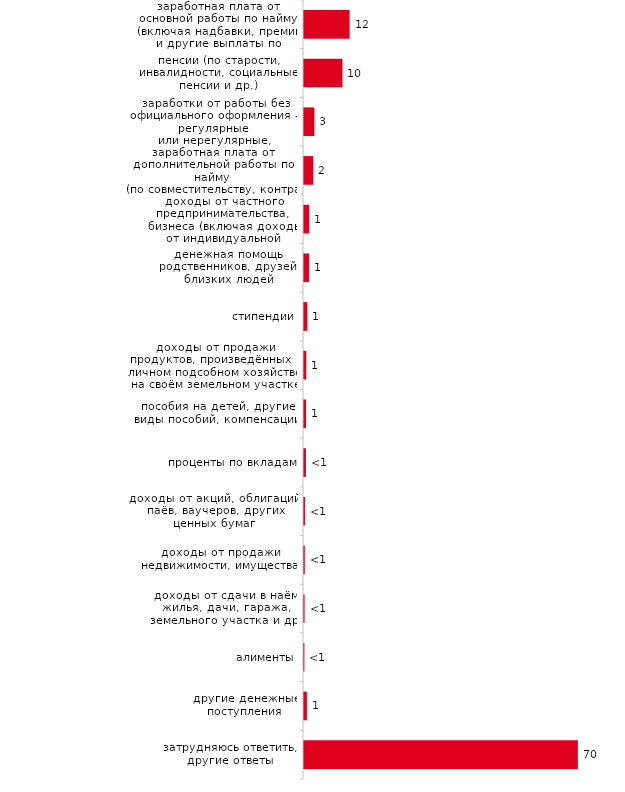
| Category | Series 0 |
|---|---|
| заработная плата от основной работы по найму (включая надбавки, премии и другие выплаты по основному месту работы) | 11.733 |
| пенсии (по старости, инвалидности, социальные пенсии и др.) | 9.901 |
| заработки от работы без официального оформления – регулярные или нерегулярные, постоянные или случайные (оказание частных услуг, торговля, производство товаров для продажи и т.п.) | 2.673 |
| заработная плата от дополнительной работы по найму (по совместительству, контракту, трудовому соглашению и т.д.) | 2.376 |
| доходы от частного предпринимательства, бизнеса (включая доходы от индивидуальной трудовой деятельности) | 1.337 |
| денежная помощь родственников, друзей, близких людей | 1.287 |
| стипендии | 0.842 |
| доходы от продажи продуктов, произведённых в личном подсобном хозяйстве, на своём земельном участке | 0.594 |
| пособия на детей, другие виды пособий, компенсации | 0.545 |
| проценты по вкладам | 0.495 |
| доходы от акций, облигаций, паёв, ваучеров, других ценных бумаг | 0.248 |
| доходы от продажи недвижимости, имущества | 0.198 |
| доходы от сдачи в наём жилья, дачи, гаража, земельного участка и др. | 0.149 |
| алименты | 0.099 |
| другие денежные поступления | 0.743 |
| затрудняюсь ответить, другие ответы | 70.446 |